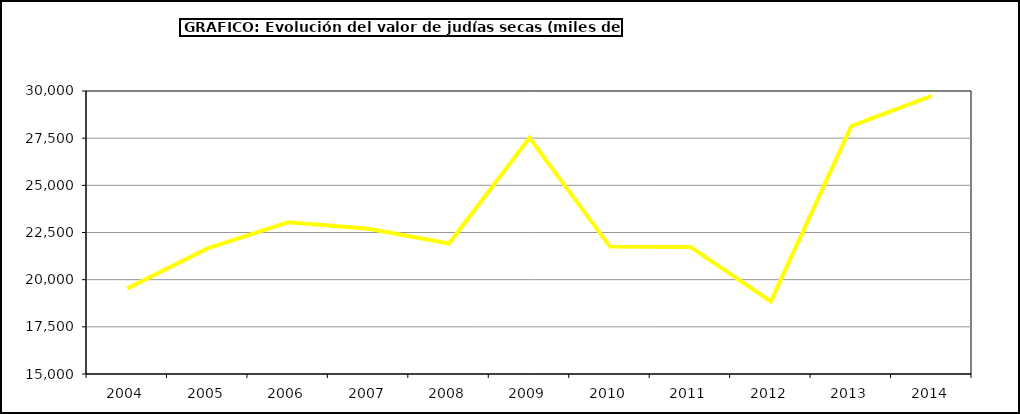
| Category | Valor |
|---|---|
| 2004.0 | 19524.763 |
| 2005.0 | 21658.048 |
| 2006.0 | 23036.992 |
| 2007.0 | 22696.538 |
| 2008.0 | 21912.603 |
| 2009.0 | 27515.988 |
| 2010.0 | 21751.277 |
| 2011.0 | 21735.778 |
| 2012.0 | 18845.19 |
| 2013.0 | 28136.167 |
| 2014.0 | 29742.558 |